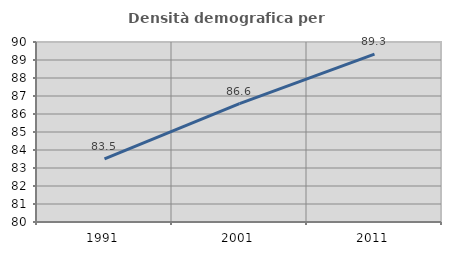
| Category | Densità demografica |
|---|---|
| 1991.0 | 83.508 |
| 2001.0 | 86.579 |
| 2011.0 | 89.328 |